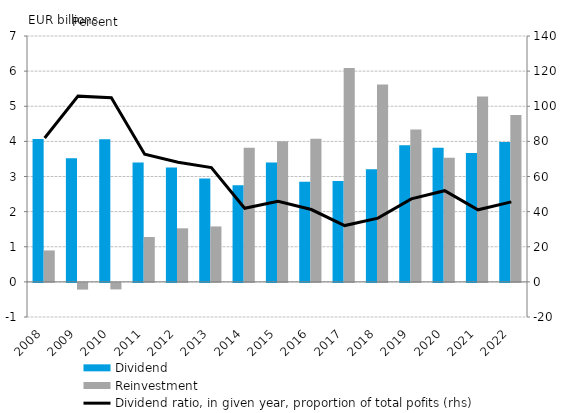
| Category | Dividend | Reinvestment |
|---|---|---|
| 2008.0 | 4.064 | 0.895 |
| 2009.0 | 3.522 | -0.192 |
| 2010.0 | 4.061 | -0.186 |
| 2011.0 | 3.399 | 1.278 |
| 2012.0 | 3.253 | 1.525 |
| 2013.0 | 2.94 | 1.578 |
| 2014.0 | 2.751 | 3.816 |
| 2015.0 | 3.396 | 4.002 |
| 2016.0 | 2.853 | 4.073 |
| 2017.0 | 2.872 | 6.088 |
| 2018.0 | 3.204 | 5.621 |
| 2019.0 | 3.893 | 4.342 |
| 2020.0 | 3.815 | 3.536 |
| 2021.0 | 3.67 | 5.277 |
| 2022.0 | 3.979 | 4.753 |